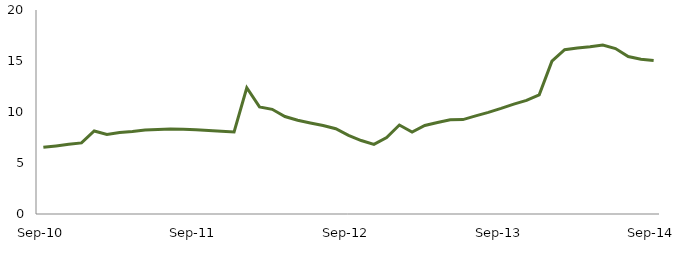
| Category | Series 0 |
|---|---|
| Sep-10 | 6.537 |
|  | 6.676 |
|  | 6.827 |
|  | 6.968 |
|  | 8.137 |
|  | 7.801 |
|  | 7.992 |
|  | 8.099 |
|  | 8.243 |
|  | 8.283 |
|  | 8.327 |
|  | 8.304 |
| Sep-11 | 8.259 |
|  | 8.185 |
|  | 8.108 |
|  | 8.036 |
|  | 12.375 |
|  | 10.497 |
|  | 10.263 |
|  | 9.559 |
|  | 9.193 |
|  | 8.922 |
|  | 8.673 |
|  | 8.362 |
| Sep-12 | 7.718 |
|  | 7.203 |
|  | 6.83 |
|  | 7.501 |
|  | 8.721 |
|  | 8.039 |
|  | 8.674 |
|  | 8.965 |
|  | 9.231 |
|  | 9.256 |
|  | 9.619 |
|  | 9.967 |
| Sep-13 | 10.353 |
|  | 10.773 |
|  | 11.141 |
|  | 11.682 |
|  | 14.982 |
|  | 16.103 |
|  | 16.268 |
|  | 16.389 |
|  | 16.574 |
|  | 16.222 |
|  | 15.434 |
|  | 15.172 |
| Sep-14 | 15.047 |